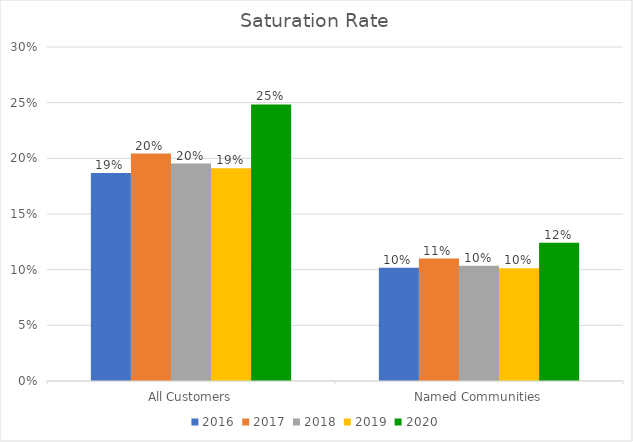
| Category | 2016 | 2017 | 2018 | 2019 | 2020 |
|---|---|---|---|---|---|
| All Customers | 0.187 | 0.204 | 0.195 | 0.191 | 0.248 |
| Named Communities | 0.102 | 0.11 | 0.103 | 0.101 | 0.124 |